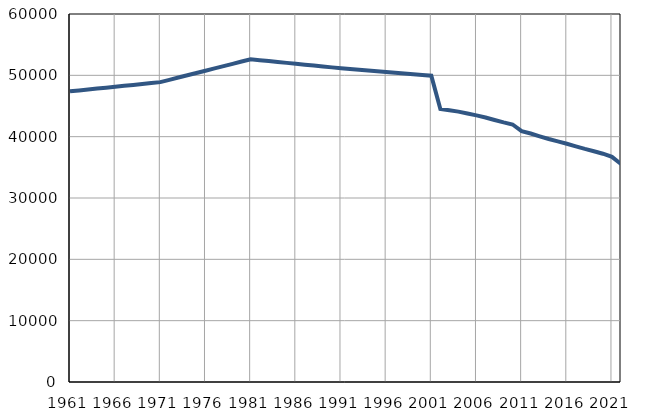
| Category | Population
size |
|---|---|
| 1961.0 | 47388 |
| 1962.0 | 47539 |
| 1963.0 | 47689 |
| 1964.0 | 47840 |
| 1965.0 | 47990 |
| 1966.0 | 48141 |
| 1967.0 | 48292 |
| 1968.0 | 48442 |
| 1969.0 | 48593 |
| 1970.0 | 48743 |
| 1971.0 | 48894 |
| 1972.0 | 49266 |
| 1973.0 | 49639 |
| 1974.0 | 50011 |
| 1975.0 | 50384 |
| 1976.0 | 50756 |
| 1977.0 | 51128 |
| 1978.0 | 51502 |
| 1979.0 | 51874 |
| 1980.0 | 52247 |
| 1981.0 | 52619 |
| 1982.0 | 52472 |
| 1983.0 | 52325 |
| 1984.0 | 52178 |
| 1985.0 | 52031 |
| 1986.0 | 51885 |
| 1987.0 | 51738 |
| 1988.0 | 51591 |
| 1989.0 | 51444 |
| 1990.0 | 51297 |
| 1991.0 | 51150 |
| 1992.0 | 51029 |
| 1993.0 | 50909 |
| 1994.0 | 50788 |
| 1995.0 | 50667 |
| 1996.0 | 50546 |
| 1997.0 | 50426 |
| 1998.0 | 50305 |
| 1999.0 | 50184 |
| 2000.0 | 50063 |
| 2001.0 | 49943 |
| 2002.0 | 44504 |
| 2003.0 | 44297 |
| 2004.0 | 44080 |
| 2005.0 | 43772 |
| 2006.0 | 43471 |
| 2007.0 | 43126 |
| 2008.0 | 42713 |
| 2009.0 | 42326 |
| 2010.0 | 41985 |
| 2011.0 | 40906 |
| 2012.0 | 40510 |
| 2013.0 | 40052 |
| 2014.0 | 39620 |
| 2015.0 | 39231 |
| 2016.0 | 38846 |
| 2017.0 | 38423 |
| 2018.0 | 38000 |
| 2019.0 | 37626 |
| 2020.0 | 37222 |
| 2021.0 | 36710 |
| 2022.0 | 35544 |